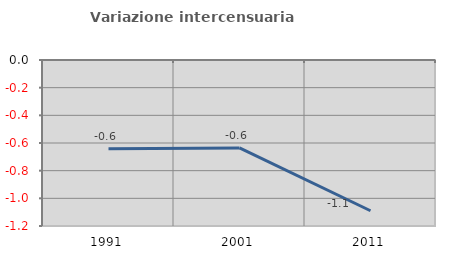
| Category | Variazione intercensuaria annua |
|---|---|
| 1991.0 | -0.642 |
| 2001.0 | -0.635 |
| 2011.0 | -1.09 |